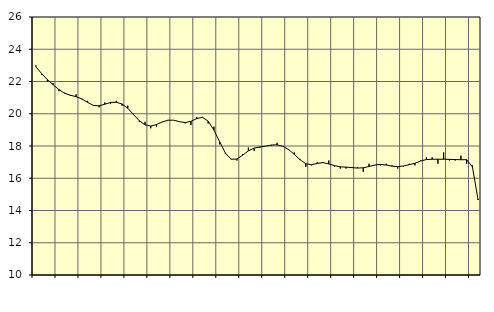
| Category | Piggar | Tillverkning o utvinning, energi o miljö, SNI 05-33, 35-39 |
|---|---|---|
| nan | 23 | 22.92 |
| 1.0 | 22.4 | 22.49 |
| 1.0 | 22 | 22.12 |
| 1.0 | 21.9 | 21.8 |
| nan | 21.4 | 21.5 |
| 2.0 | 21.3 | 21.27 |
| 2.0 | 21.1 | 21.15 |
| 2.0 | 21.2 | 21.06 |
| nan | 20.9 | 20.92 |
| 3.0 | 20.8 | 20.71 |
| 3.0 | 20.5 | 20.52 |
| 3.0 | 20.4 | 20.49 |
| nan | 20.7 | 20.59 |
| 4.0 | 20.6 | 20.7 |
| 4.0 | 20.8 | 20.71 |
| 4.0 | 20.5 | 20.61 |
| nan | 20.5 | 20.34 |
| 5.0 | 20 | 19.95 |
| 5.0 | 19.5 | 19.57 |
| 5.0 | 19.5 | 19.31 |
| nan | 19.1 | 19.24 |
| 6.0 | 19.2 | 19.33 |
| 6.0 | 19.5 | 19.49 |
| 6.0 | 19.6 | 19.6 |
| nan | 19.6 | 19.6 |
| 7.0 | 19.5 | 19.51 |
| 7.0 | 19.4 | 19.45 |
| 7.0 | 19.3 | 19.53 |
| nan | 19.8 | 19.7 |
| 8.0 | 19.8 | 19.78 |
| 8.0 | 19.4 | 19.54 |
| 8.0 | 19.2 | 18.98 |
| nan | 18.1 | 18.26 |
| 9.0 | 17.5 | 17.56 |
| 9.0 | 17.2 | 17.18 |
| 9.0 | 17.1 | 17.19 |
| nan | 17.5 | 17.43 |
| 10.0 | 17.9 | 17.7 |
| 10.0 | 17.7 | 17.87 |
| 10.0 | 17.9 | 17.94 |
| nan | 18 | 17.99 |
| 11.0 | 18 | 18.06 |
| 11.0 | 18.2 | 18.07 |
| 11.0 | 18 | 17.98 |
| nan | 17.8 | 17.78 |
| 12.0 | 17.6 | 17.48 |
| 12.0 | 17.2 | 17.15 |
| 12.0 | 16.7 | 16.9 |
| nan | 16.8 | 16.84 |
| 13.0 | 17 | 16.92 |
| 13.0 | 17 | 16.97 |
| 13.0 | 17.1 | 16.89 |
| nan | 16.7 | 16.78 |
| 14.0 | 16.6 | 16.71 |
| 14.0 | 16.6 | 16.69 |
| 14.0 | 16.7 | 16.66 |
| nan | 16.7 | 16.63 |
| 15.0 | 16.4 | 16.65 |
| 15.0 | 16.9 | 16.73 |
| 15.0 | 16.8 | 16.82 |
| nan | 16.8 | 16.86 |
| 16.0 | 16.9 | 16.82 |
| 16.0 | 16.8 | 16.75 |
| 16.0 | 16.6 | 16.72 |
| nan | 16.7 | 16.76 |
| 17.0 | 16.9 | 16.84 |
| 17.0 | 16.8 | 16.93 |
| 17.0 | 17.1 | 17.07 |
| nan | 17.3 | 17.16 |
| 18.0 | 17.3 | 17.18 |
| 18.0 | 16.9 | 17.18 |
| 18.0 | 17.6 | 17.18 |
| nan | 17.1 | 17.17 |
| 19.0 | 17.1 | 17.16 |
| 19.0 | 17.4 | 17.15 |
| 19.0 | 16.9 | 17.15 |
| nan | 16.8 | 16.71 |
| 20.0 | 14.7 | 14.65 |